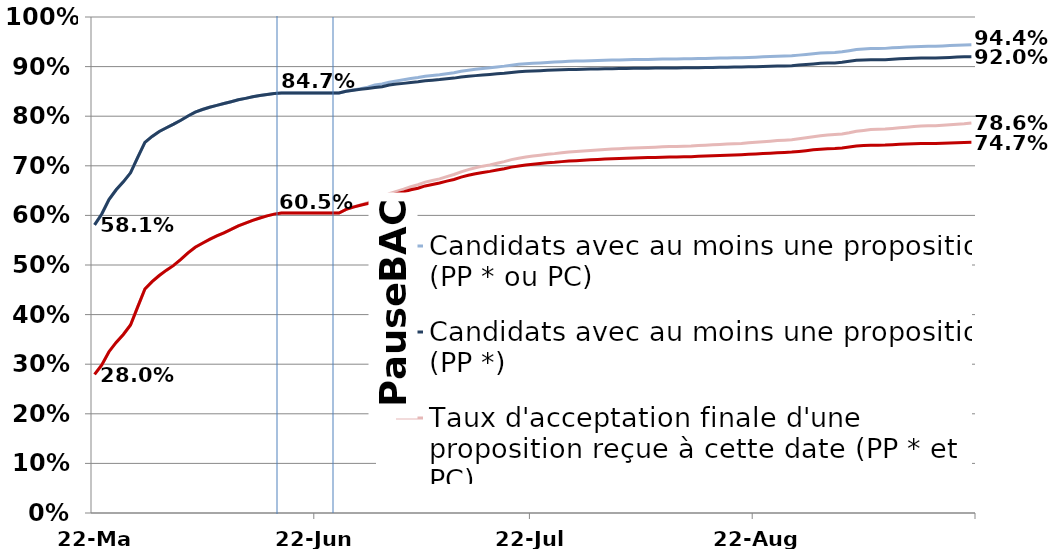
| Category | Candidats avec au moins une proposition (PP * ou PC) | Candidats avec au moins une proposition (PP *) | Taux d'acceptation finale d'une proposition reçue à cette date (PP * et PC) | Taux d'acceptation finale d'une proposition reçue à cette date  (PP *) |
|---|---|---|---|---|
| 2018-05-22 | 0.581 | 0.581 | 0.28 | 0.28 |
| 2018-05-23 | 0.603 | 0.603 | 0.298 | 0.298 |
| 2018-05-24 | 0.632 | 0.632 | 0.325 | 0.325 |
| 2018-05-25 | 0.652 | 0.652 | 0.344 | 0.344 |
| 2018-05-26 | 0.668 | 0.668 | 0.36 | 0.36 |
| 2018-05-27 | 0.686 | 0.686 | 0.379 | 0.379 |
| 2018-05-28 | 0.717 | 0.717 | 0.416 | 0.416 |
| 2018-05-29 | 0.747 | 0.747 | 0.452 | 0.452 |
| 2018-05-30 | 0.759 | 0.759 | 0.466 | 0.466 |
| 2018-05-31 | 0.769 | 0.769 | 0.479 | 0.479 |
| 2018-06-01 | 0.777 | 0.777 | 0.49 | 0.49 |
| 2018-06-02 | 0.784 | 0.784 | 0.499 | 0.499 |
| 2018-06-03 | 0.792 | 0.792 | 0.511 | 0.511 |
| 2018-06-04 | 0.8 | 0.8 | 0.524 | 0.524 |
| 2018-06-05 | 0.808 | 0.808 | 0.536 | 0.536 |
| 2018-06-06 | 0.813 | 0.813 | 0.544 | 0.544 |
| 2018-06-07 | 0.818 | 0.818 | 0.552 | 0.552 |
| 2018-06-08 | 0.822 | 0.822 | 0.559 | 0.559 |
| 2018-06-09 | 0.826 | 0.826 | 0.565 | 0.565 |
| 2018-06-10 | 0.829 | 0.829 | 0.572 | 0.572 |
| 2018-06-11 | 0.833 | 0.833 | 0.579 | 0.579 |
| 2018-06-12 | 0.836 | 0.836 | 0.584 | 0.584 |
| 2018-06-13 | 0.839 | 0.839 | 0.59 | 0.59 |
| 2018-06-14 | 0.842 | 0.842 | 0.595 | 0.595 |
| 2018-06-15 | 0.844 | 0.844 | 0.599 | 0.599 |
| 2018-06-16 | 0.846 | 0.846 | 0.603 | 0.603 |
| 2018-06-17 | 0.847 | 0.847 | 0.605 | 0.605 |
| 2018-06-18 | 0.847 | 0.847 | 0.605 | 0.605 |
| 2018-06-19 | 0.847 | 0.847 | 0.605 | 0.605 |
| 2018-06-20 | 0.847 | 0.847 | 0.605 | 0.605 |
| 2018-06-21 | 0.847 | 0.847 | 0.605 | 0.605 |
| 2018-06-22 | 0.847 | 0.847 | 0.605 | 0.605 |
| 2018-06-23 | 0.847 | 0.847 | 0.605 | 0.605 |
| 2018-06-24 | 0.847 | 0.847 | 0.605 | 0.605 |
| 2018-06-25 | 0.847 | 0.847 | 0.605 | 0.605 |
| 2018-06-26 | 0.85 | 0.85 | 0.612 | 0.612 |
| 2018-06-27 | 0.853 | 0.852 | 0.617 | 0.617 |
| 2018-06-28 | 0.856 | 0.854 | 0.621 | 0.62 |
| 2018-06-29 | 0.859 | 0.856 | 0.626 | 0.624 |
| 2018-06-30 | 0.863 | 0.858 | 0.632 | 0.628 |
| 2018-07-01 | 0.865 | 0.859 | 0.636 | 0.632 |
| 2018-07-02 | 0.869 | 0.863 | 0.644 | 0.64 |
| 2018-07-03 | 0.871 | 0.865 | 0.649 | 0.644 |
| 2018-07-04 | 0.873 | 0.866 | 0.653 | 0.647 |
| 2018-07-05 | 0.876 | 0.868 | 0.658 | 0.652 |
| 2018-07-06 | 0.878 | 0.869 | 0.662 | 0.655 |
| 2018-07-07 | 0.881 | 0.871 | 0.667 | 0.659 |
| 2018-07-08 | 0.882 | 0.873 | 0.67 | 0.662 |
| 2018-07-09 | 0.884 | 0.874 | 0.674 | 0.665 |
| 2018-07-10 | 0.886 | 0.875 | 0.678 | 0.669 |
| 2018-07-11 | 0.888 | 0.877 | 0.682 | 0.672 |
| 2018-07-12 | 0.89 | 0.879 | 0.688 | 0.677 |
| 2018-07-13 | 0.893 | 0.881 | 0.692 | 0.681 |
| 2018-07-14 | 0.895 | 0.882 | 0.696 | 0.684 |
| 2018-07-15 | 0.896 | 0.883 | 0.699 | 0.686 |
| 2018-07-16 | 0.898 | 0.884 | 0.702 | 0.689 |
| 2018-07-17 | 0.899 | 0.886 | 0.705 | 0.691 |
| 2018-07-18 | 0.901 | 0.887 | 0.708 | 0.694 |
| 2018-07-19 | 0.903 | 0.888 | 0.712 | 0.697 |
| 2018-07-20 | 0.905 | 0.89 | 0.715 | 0.7 |
| 2018-07-21 | 0.906 | 0.89 | 0.718 | 0.701 |
| 2018-07-22 | 0.907 | 0.891 | 0.72 | 0.703 |
| 2018-07-23 | 0.907 | 0.892 | 0.721 | 0.705 |
| 2018-07-24 | 0.908 | 0.892 | 0.723 | 0.706 |
| 2018-07-25 | 0.909 | 0.893 | 0.725 | 0.707 |
| 2018-07-26 | 0.91 | 0.894 | 0.726 | 0.708 |
| 2018-07-27 | 0.911 | 0.894 | 0.728 | 0.709 |
| 2018-07-28 | 0.911 | 0.894 | 0.729 | 0.71 |
| 2018-07-29 | 0.912 | 0.895 | 0.73 | 0.711 |
| 2018-07-30 | 0.912 | 0.895 | 0.731 | 0.712 |
| 2018-07-31 | 0.912 | 0.895 | 0.732 | 0.713 |
| 2018-08-01 | 0.913 | 0.896 | 0.733 | 0.714 |
| 2018-08-02 | 0.913 | 0.896 | 0.734 | 0.714 |
| 2018-08-03 | 0.914 | 0.896 | 0.735 | 0.715 |
| 2018-08-04 | 0.914 | 0.896 | 0.735 | 0.715 |
| 2018-08-05 | 0.914 | 0.897 | 0.736 | 0.716 |
| 2018-08-06 | 0.914 | 0.897 | 0.736 | 0.716 |
| 2018-08-07 | 0.915 | 0.897 | 0.737 | 0.717 |
| 2018-08-08 | 0.915 | 0.897 | 0.738 | 0.717 |
| 2018-08-09 | 0.915 | 0.897 | 0.738 | 0.717 |
| 2018-08-10 | 0.915 | 0.897 | 0.739 | 0.718 |
| 2018-08-11 | 0.916 | 0.897 | 0.739 | 0.718 |
| 2018-08-12 | 0.916 | 0.898 | 0.739 | 0.718 |
| 2018-08-13 | 0.916 | 0.898 | 0.74 | 0.718 |
| 2018-08-14 | 0.916 | 0.898 | 0.741 | 0.719 |
| 2018-08-15 | 0.917 | 0.898 | 0.742 | 0.72 |
| 2018-08-16 | 0.917 | 0.898 | 0.742 | 0.72 |
| 2018-08-17 | 0.917 | 0.899 | 0.743 | 0.721 |
| 2018-08-18 | 0.917 | 0.899 | 0.744 | 0.721 |
| 2018-08-19 | 0.918 | 0.899 | 0.744 | 0.722 |
| 2018-08-20 | 0.918 | 0.899 | 0.745 | 0.722 |
| 2018-08-21 | 0.918 | 0.9 | 0.746 | 0.723 |
| 2018-08-22 | 0.919 | 0.9 | 0.747 | 0.724 |
| 2018-08-23 | 0.92 | 0.9 | 0.749 | 0.725 |
| 2018-08-24 | 0.92 | 0.901 | 0.75 | 0.725 |
| 2018-08-25 | 0.921 | 0.901 | 0.751 | 0.726 |
| 2018-08-26 | 0.921 | 0.901 | 0.752 | 0.727 |
| 2018-08-27 | 0.922 | 0.902 | 0.753 | 0.728 |
| 2018-08-28 | 0.923 | 0.903 | 0.754 | 0.729 |
| 2018-08-29 | 0.924 | 0.904 | 0.756 | 0.731 |
| 2018-08-30 | 0.926 | 0.905 | 0.759 | 0.732 |
| 2018-08-31 | 0.927 | 0.907 | 0.761 | 0.734 |
| 2018-09-01 | 0.928 | 0.907 | 0.762 | 0.734 |
| 2018-09-02 | 0.929 | 0.907 | 0.763 | 0.735 |
| 2018-09-03 | 0.93 | 0.909 | 0.764 | 0.736 |
| 2018-09-04 | 0.932 | 0.911 | 0.767 | 0.738 |
| 2018-09-05 | 0.934 | 0.913 | 0.77 | 0.74 |
| 2018-09-06 | 0.935 | 0.913 | 0.771 | 0.741 |
| 2018-09-07 | 0.936 | 0.914 | 0.773 | 0.742 |
| 2018-09-08 | 0.937 | 0.914 | 0.774 | 0.742 |
| 2018-09-09 | 0.937 | 0.914 | 0.774 | 0.742 |
| 2018-09-10 | 0.938 | 0.915 | 0.775 | 0.742 |
| 2018-09-11 | 0.939 | 0.916 | 0.777 | 0.743 |
| 2018-09-12 | 0.939 | 0.916 | 0.778 | 0.744 |
| 2018-09-13 | 0.94 | 0.917 | 0.779 | 0.744 |
| 2018-09-14 | 0.941 | 0.917 | 0.78 | 0.745 |
| 2018-09-15 | 0.941 | 0.917 | 0.781 | 0.745 |
| 2018-09-16 | 0.941 | 0.917 | 0.781 | 0.745 |
| 2018-09-17 | 0.942 | 0.918 | 0.782 | 0.746 |
| 2018-09-18 | 0.942 | 0.919 | 0.783 | 0.746 |
| 2018-09-19 | 0.943 | 0.919 | 0.784 | 0.746 |
| 2018-09-20 | 0.944 | 0.92 | 0.785 | 0.747 |
| 2018-09-21 | 0.944 | 0.92 | 0.786 | 0.747 |